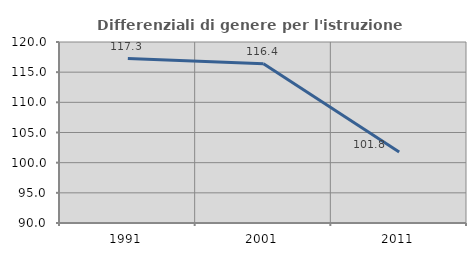
| Category | Differenziali di genere per l'istruzione superiore |
|---|---|
| 1991.0 | 117.257 |
| 2001.0 | 116.391 |
| 2011.0 | 101.787 |